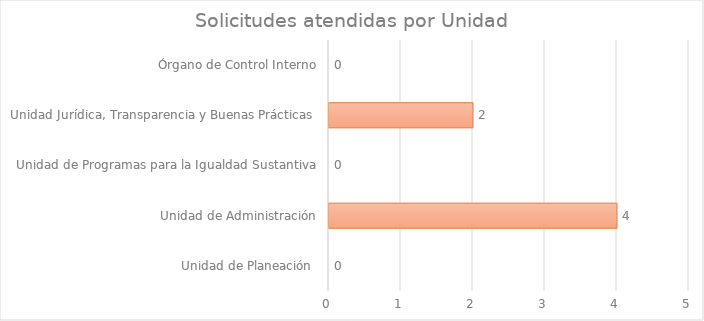
| Category | Series 1 |
|---|---|
| Unidad de Planeación  | 0 |
| Unidad de Administración | 4 |
| Unidad de Programas para la Igualdad Sustantiva | 0 |
| Unidad Jurídica, Transparencia y Buenas Prácticas  | 2 |
| Órgano de Control Interno | 0 |